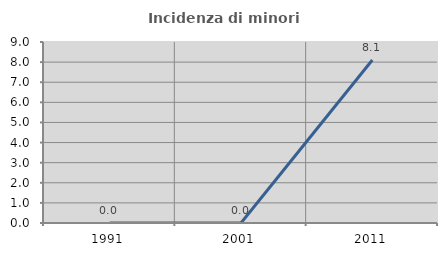
| Category | Incidenza di minori stranieri |
|---|---|
| 1991.0 | 0 |
| 2001.0 | 0 |
| 2011.0 | 8.108 |